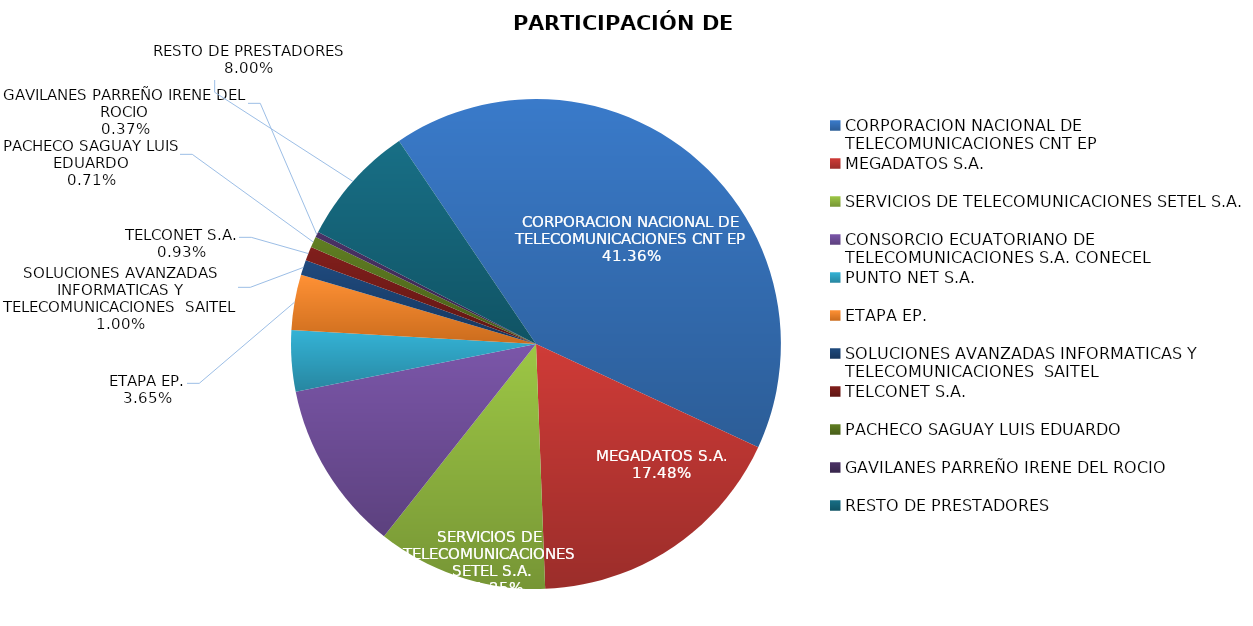
| Category | PARTICIPACIÓN DE MERCADO |
|---|---|
| CORPORACION NACIONAL DE TELECOMUNICACIONES CNT EP | 0.414 |
| MEGADATOS S.A. | 0.175 |
| SERVICIOS DE TELECOMUNICACIONES SETEL S.A. | 0.112 |
| CONSORCIO ECUATORIANO DE TELECOMUNICACIONES S.A. CONECEL | 0.112 |
| PUNTO NET S.A. | 0.04 |
| ETAPA EP. | 0.037 |
| SOLUCIONES AVANZADAS INFORMATICAS Y TELECOMUNICACIONES  SAITEL | 0.01 |
| TELCONET S.A. | 0.009 |
| PACHECO SAGUAY LUIS EDUARDO | 0.007 |
| GAVILANES PARREÑO IRENE DEL ROCIO | 0.004 |
| RESTO DE PRESTADORES | 0.08 |